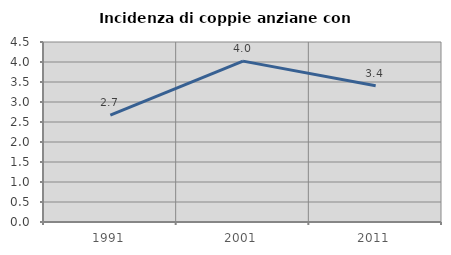
| Category | Incidenza di coppie anziane con figli |
|---|---|
| 1991.0 | 2.671 |
| 2001.0 | 4.022 |
| 2011.0 | 3.407 |